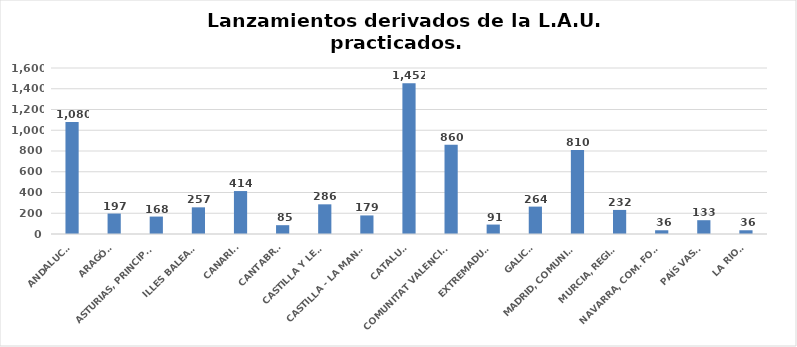
| Category | Series 0 |
|---|---|
| ANDALUCÍA | 1080 |
| ARAGÓN | 197 |
| ASTURIAS, PRINCIPADO | 168 |
| ILLES BALEARS | 257 |
| CANARIAS | 414 |
| CANTABRIA | 85 |
| CASTILLA Y LEÓN | 286 |
| CASTILLA - LA MANCHA | 179 |
| CATALUÑA | 1452 |
| COMUNITAT VALENCIANA | 860 |
| EXTREMADURA | 91 |
| GALICIA | 264 |
| MADRID, COMUNIDAD | 810 |
| MURCIA, REGIÓN | 232 |
| NAVARRA, COM. FORAL | 36 |
| PAÍS VASCO | 133 |
| LA RIOJA | 36 |